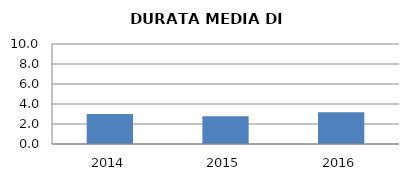
| Category | 2014 2015 2016 |
|---|---|
| 2014.0 | 3 |
| 2015.0 | 2.786 |
| 2016.0 | 3.167 |